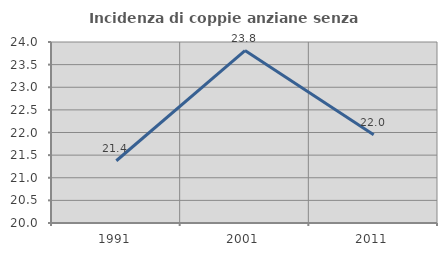
| Category | Incidenza di coppie anziane senza figli  |
|---|---|
| 1991.0 | 21.376 |
| 2001.0 | 23.81 |
| 2011.0 | 21.951 |